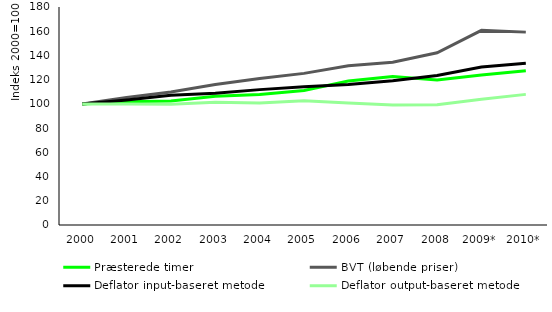
| Category | Præsterede timer | BVT (løbende priser) | Deflator input-baseret metode | Deflator output-baseret metode |
|---|---|---|---|---|
| 2000 | 100 | 100 | 100 | 100 |
| 2001 | 101.717 | 105.356 | 103.3 | 100 |
| 2002 | 102.334 | 109.878 | 107.122 | 99.8 |
| 2003 | 106.382 | 116.01 | 108.729 | 101.397 |
| 2004 | 107.782 | 120.934 | 111.773 | 100.788 |
| 2005 | 111.1 | 125.186 | 114.121 | 102.502 |
| 2006 | 118.85 | 131.439 | 115.947 | 100.759 |
| 2007 | 122.667 | 134.342 | 119.193 | 99.046 |
| 2008 | 119.822 | 142.252 | 123.365 | 99.344 |
| 2009* | 123.882 | 160.693 | 130.52 | 103.814 |
| 2010* | 127.351 | 159.255 | 133.652 | 107.863 |